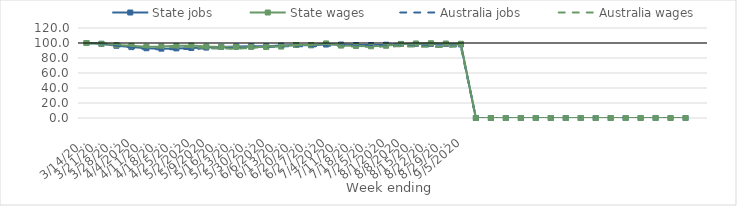
| Category | State jobs | State wages | Australia jobs | Australia wages |
|---|---|---|---|---|
| 14/03/2020 | 100 | 100 | 100 | 100 |
| 21/03/2020 | 98.89 | 98.914 | 99.287 | 99.672 |
| 28/03/2020 | 96.32 | 97.243 | 96.324 | 98.416 |
| 04/04/2020 | 94.518 | 96.194 | 93.668 | 96.718 |
| 11/04/2020 | 92.993 | 95.149 | 91.934 | 94.131 |
| 18/04/2020 | 92.463 | 95.321 | 91.469 | 94.023 |
| 25/04/2020 | 92.797 | 96.199 | 91.796 | 94.249 |
| 02/05/2020 | 93.305 | 96.537 | 92.192 | 94.719 |
| 09/05/2020 | 93.894 | 95.301 | 92.74 | 93.349 |
| 16/05/2020 | 94.72 | 94.811 | 93.27 | 92.686 |
| 23/05/2020 | 95.398 | 94.803 | 93.57 | 92.302 |
| 30/05/2020 | 95.652 | 94.796 | 94.082 | 93.6 |
| 06/06/2020 | 95.618 | 94.734 | 94.995 | 95.373 |
| 13/06/2020 | 96.549 | 95.218 | 95.458 | 96.064 |
| 20/06/2020 | 97.328 | 97.284 | 95.654 | 96.971 |
| 27/06/2020 | 96.975 | 97.31 | 95.59 | 97.092 |
| 04/07/2020 | 97.952 | 99.472 | 96.269 | 98.79 |
| 11/07/2020 | 97.926 | 96.535 | 96.518 | 95.694 |
| 18/07/2020 | 97.297 | 95.991 | 96.375 | 95.102 |
| 25/07/2020 | 97.292 | 95.658 | 96.44 | 94.758 |
| 01/08/2020 | 97.72 | 96.29 | 96.466 | 95.35 |
| 08/08/2020 | 98.751 | 98.654 | 96.196 | 95.604 |
| 15/08/2020 | 98.86 | 99.274 | 96.048 | 95.29 |
| 22/08/2020 | 98.833 | 99.721 | 95.872 | 94.881 |
| 29/08/2020 | 98.808 | 99.258 | 95.598 | 94.692 |
| 05/09/2020 | 98.037 | 98.987 | 95.533 | 95.73 |